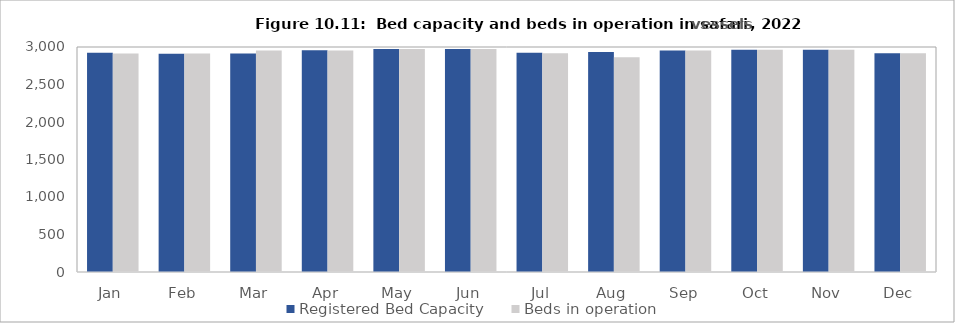
| Category | Registered Bed Capacity  | Beds in operation  |
|---|---|---|
| Jan | 2923 | 2912 |
| Feb | 2911 | 2912 |
| Mar | 2915 | 2953 |
| Apr | 2958 | 2954 |
| May | 2972 | 2972 |
| Jun | 2972 | 2972 |
| Jul | 2924 | 2917 |
| Aug | 2932 | 2864 |
| Sep | 2955 | 2955 |
| Oct | 2963 | 2963 |
| Nov | 2963 | 2963 |
| Dec | 2918 | 2918 |